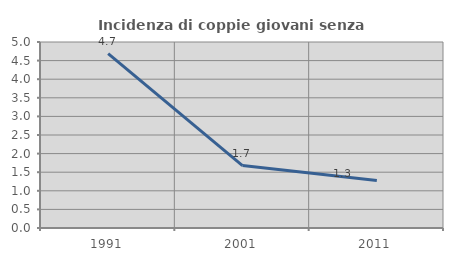
| Category | Incidenza di coppie giovani senza figli |
|---|---|
| 1991.0 | 4.688 |
| 2001.0 | 1.678 |
| 2011.0 | 1.274 |